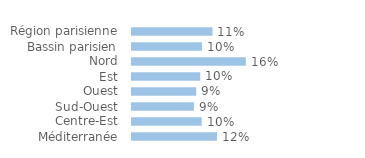
| Category | Series 0 |
|---|---|
| Région parisienne | 0.114 |
| Bassin parisien | 0.099 |
| Nord | 0.161 |
| Est | 0.097 |
| Ouest | 0.091 |
| Sud-Ouest | 0.088 |
| Centre-Est | 0.099 |
| Méditerranée | 0.12 |